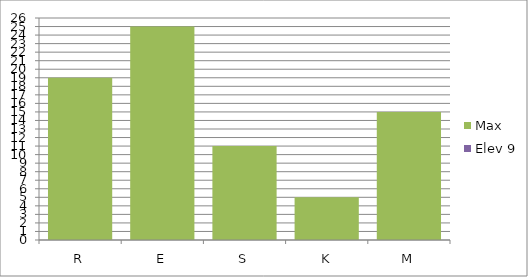
| Category | Max | Elev 9 |
|---|---|---|
| R | 19 | 0 |
| E | 25 | 0 |
| S | 11 | 0 |
| K | 5 | 0 |
| M | 15 | 0 |